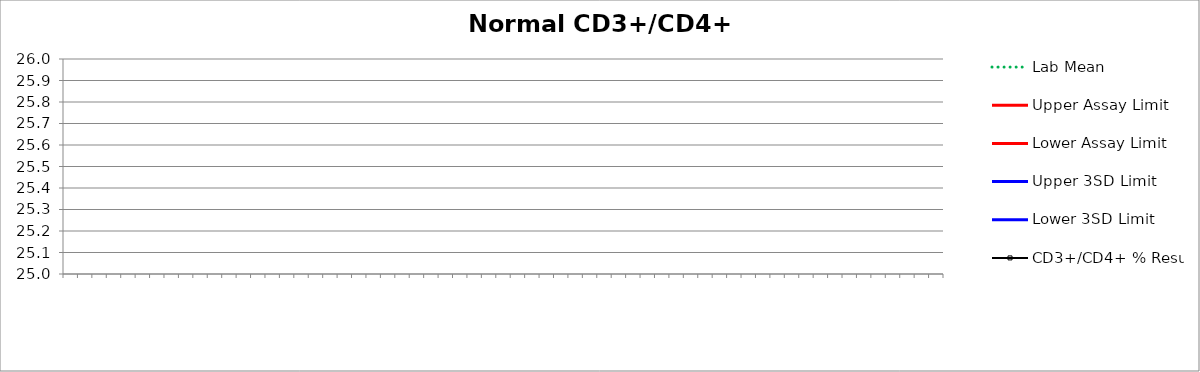
| Category | Lab Mean | Upper Assay Limit | Lower Assay Limit | Upper 3SD Limit | Lower 3SD Limit | CD3+/CD4+ % Result |
|---|---|---|---|---|---|---|
|  | 0 |  |  | 0 | 0 |  |
|  | 0 |  |  | 0 | 0 |  |
|  | 0 |  |  | 0 | 0 |  |
|  | 0 |  |  | 0 | 0 |  |
|  | 0 |  |  | 0 | 0 |  |
|  | 0 |  |  | 0 | 0 |  |
|  | 0 |  |  | 0 | 0 |  |
|  | 0 |  |  | 0 | 0 |  |
|  | 0 |  |  | 0 | 0 |  |
|  | 0 |  |  | 0 | 0 |  |
|  | 0 |  |  | 0 | 0 |  |
|  | 0 |  |  | 0 | 0 |  |
|  | 0 |  |  | 0 | 0 |  |
|  | 0 |  |  | 0 | 0 |  |
|  | 0 |  |  | 0 | 0 |  |
|  | 0 |  |  | 0 | 0 |  |
|  | 0 |  |  | 0 | 0 |  |
|  | 0 |  |  | 0 | 0 |  |
|  | 0 |  |  | 0 | 0 |  |
|  | 0 |  |  | 0 | 0 |  |
|  | 0 |  |  | 0 | 0 |  |
|  | 0 |  |  | 0 | 0 |  |
|  | 0 |  |  | 0 | 0 |  |
|  | 0 |  |  | 0 | 0 |  |
|  | 0 |  |  | 0 | 0 |  |
|  | 0 |  |  | 0 | 0 |  |
|  | 0 |  |  | 0 | 0 |  |
|  | 0 |  |  | 0 | 0 |  |
|  | 0 |  |  | 0 | 0 |  |
|  | 0 |  |  | 0 | 0 |  |
|  | 0 |  |  | 0 | 0 |  |
|  | 0 |  |  | 0 | 0 |  |
|  | 0 |  |  | 0 | 0 |  |
|  | 0 |  |  | 0 | 0 |  |
|  | 0 |  |  | 0 | 0 |  |
|  | 0 |  |  | 0 | 0 |  |
|  | 0 |  |  | 0 | 0 |  |
|  | 0 |  |  | 0 | 0 |  |
|  | 0 |  |  | 0 | 0 |  |
|  | 0 |  |  | 0 | 0 |  |
|  | 0 |  |  | 0 | 0 |  |
|  | 0 |  |  | 0 | 0 |  |
|  | 0 |  |  | 0 | 0 |  |
|  | 0 |  |  | 0 | 0 |  |
|  | 0 |  |  | 0 | 0 |  |
|  | 0 |  |  | 0 | 0 |  |
|  | 0 |  |  | 0 | 0 |  |
|  | 0 |  |  | 0 | 0 |  |
|  | 0 |  |  | 0 | 0 |  |
|  | 0 |  |  | 0 | 0 |  |
|  | 0 |  |  | 0 | 0 |  |
|  | 0 |  |  | 0 | 0 |  |
|  | 0 |  |  | 0 | 0 |  |
|  | 0 |  |  | 0 | 0 |  |
|  | 0 |  |  | 0 | 0 |  |
|  | 0 |  |  | 0 | 0 |  |
|  | 0 |  |  | 0 | 0 |  |
|  | 0 |  |  | 0 | 0 |  |
|  | 0 |  |  | 0 | 0 |  |
|  | 0 |  |  | 0 | 0 |  |
|  | 0 |  |  | 0 | 0 |  |